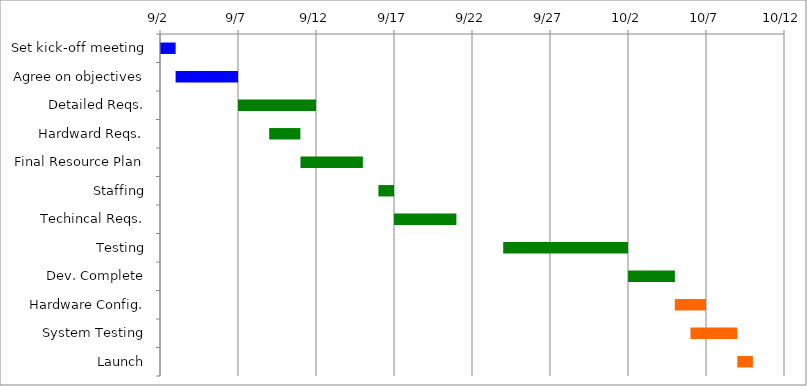
| Category | Start | Days |
|---|---|---|
| Set kick-off meeting | 2015-09-02 | 1 |
| Agree on objectives | 2015-09-03 | 4 |
| Detailed Reqs. | 2015-09-07 | 5 |
| Hardward Reqs. | 2015-09-09 | 2 |
| Final Resource Plan | 2015-09-11 | 4 |
| Staffing | 2015-09-16 | 1 |
| Techincal Reqs. | 2015-09-17 | 4 |
| Testing | 2015-09-24 | 8 |
| Dev. Complete | 2015-10-02 | 3 |
| Hardware Config. | 2015-10-05 | 2 |
| System Testing | 2015-10-06 | 3 |
| Launch | 2015-10-09 | 1 |